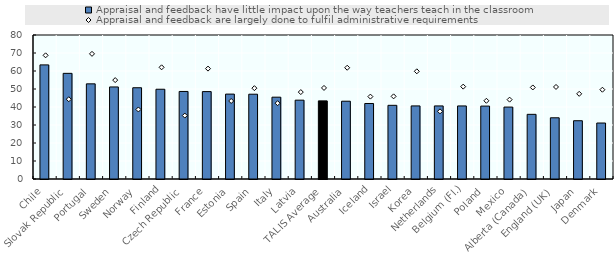
| Category | Appraisal and feedback have little impact upon the way teachers teach in the classroom |
|---|---|
| Chile | 63.401 |
| Slovak Republic | 58.696 |
| Portugal | 52.858 |
| Sweden | 51.138 |
| Norway | 50.699 |
| Finland | 49.862 |
| Czech Republic | 48.629 |
| France | 48.553 |
| Estonia | 47.17 |
| Spain | 47.102 |
| Italy | 45.457 |
| Latvia | 43.794 |
| TALIS Average | 43.398 |
| Australia | 43.215 |
| Iceland | 41.953 |
| Israel | 40.932 |
| Korea | 40.599 |
| Netherlands | 40.598 |
| Belgium (Fl.) | 40.589 |
| Poland | 40.507 |
| Mexico | 39.959 |
| Alberta (Canada) | 35.923 |
| England (UK) | 34.004 |
| Japan | 32.378 |
| Denmark | 31.101 |